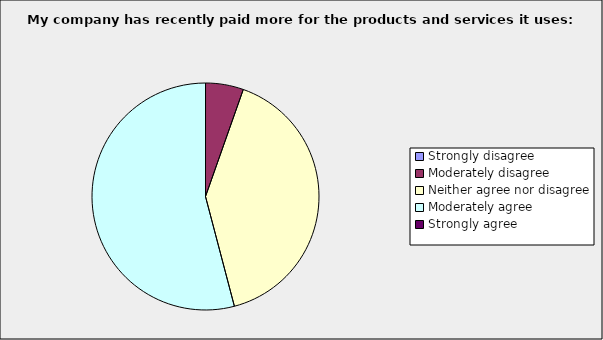
| Category | Series 0 |
|---|---|
| Strongly disagree | 0 |
| Moderately disagree | 0.054 |
| Neither agree nor disagree | 0.405 |
| Moderately agree | 0.541 |
| Strongly agree | 0 |